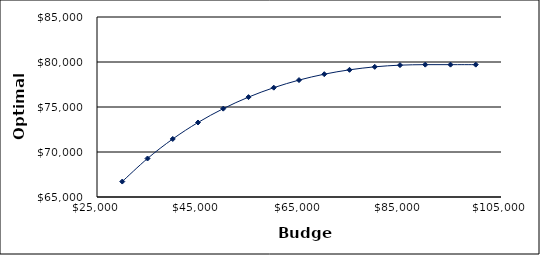
| Category | Series 0 |
|---|---|
| 30000.0 | 66715.51 |
| 35000.0 | 69277.47 |
| 40000.0 | 71446.79 |
| 45000.0 | 73278.96 |
| 50000.0 | 74817.49 |
| 55000.0 | 76097.27 |
| 60000.0 | 77146.78 |
| 65000.0 | 77989.64 |
| 70000.0 | 78645.68 |
| 75000.0 | 79131.76 |
| 80000.0 | 79462.32 |
| 85000.0 | 79649.9 |
| 90000.0 | 79705.63 |
| 95000.0 | 79705.63 |
| 100000.0 | 79705.63 |